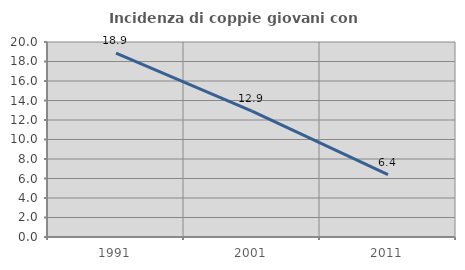
| Category | Incidenza di coppie giovani con figli |
|---|---|
| 1991.0 | 18.855 |
| 2001.0 | 12.911 |
| 2011.0 | 6.406 |